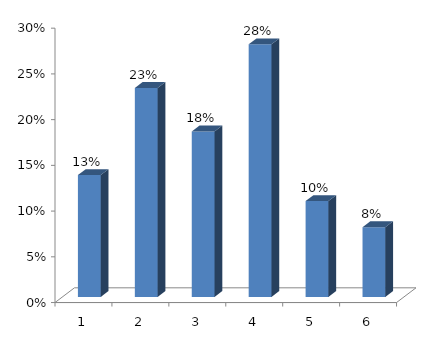
| Category | Series 0 |
|---|---|
| 0 | 0.133 |
| 1 | 0.229 |
| 2 | 0.181 |
| 3 | 0.276 |
| 4 | 0.105 |
| 5 | 0.076 |